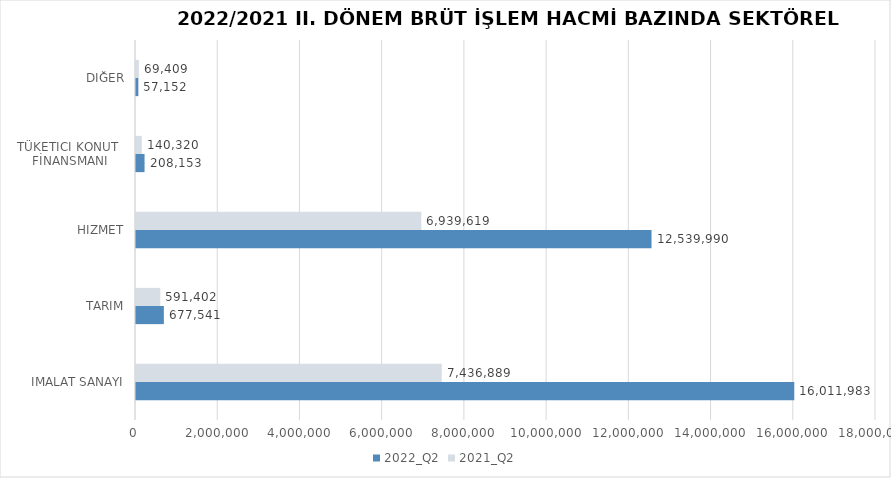
| Category | 2022_Q2 | 2021_Q2 |
|---|---|---|
| İMALAT SANAYİ | 16011983.02 | 7436889.296 |
| TARIM | 677541.183 | 591401.888 |
| HİZMET | 12539990.332 | 6939619.239 |
| TÜKETİCİ KONUT 
FİNANSMANI | 208153 | 140320 |
| DİĞER | 57152 | 69409 |